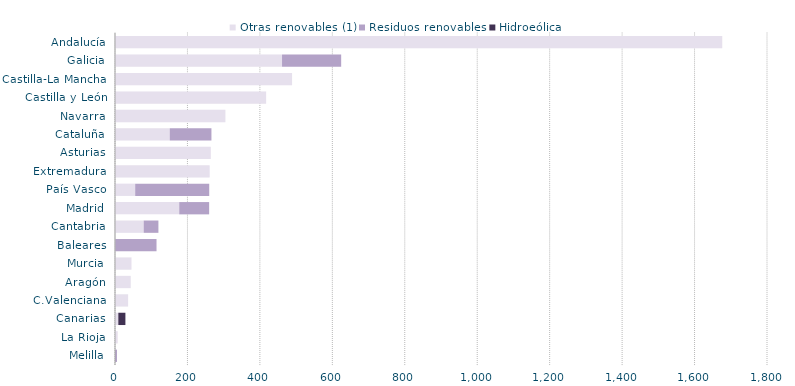
| Category | Otras renovables (1) | Residuos renovables | Hidroeólica |
|---|---|---|---|
| Melilla | 0 | 5.526 | 0 |
| La Rioja | 7.44 | 0 | 0 |
| Canarias | 9.187 | 0 | 19.54 |
| C.Valenciana | 36.284 | 0 | 0 |
| Aragón | 43.439 | 0 | 0 |
| Murcia | 45.492 | 0 | 0 |
| Baleares | 0.629 | 114.002 | 0 |
| Cantabria | 79.164 | 40.703 | 0 |
| Madrid | 177.328 | 82.589 | 0 |
| País Vasco | 55.702 | 204.44 | 0 |
| Extremadura | 261.341 | 0 | 0 |
| Asturias | 264.467 | 0 | 0 |
| Cataluña | 151.108 | 115.14 | 0 |
| Navarra | 304.764 | 0 | 0 |
| Castilla y León | 417.238 | 0 | 0 |
| Castilla-La Mancha | 488.868 | 0 | 0 |
| Galicia | 461.153 | 163.252 | 0 |
| Andalucía | 1676.501 | 0 | 0 |